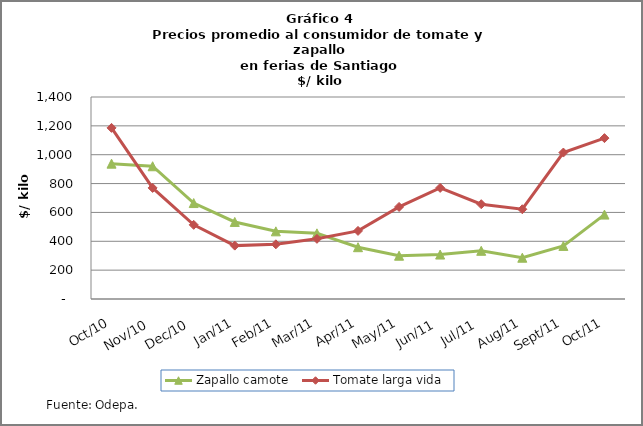
| Category | Zapallo camote | Tomate larga vida |
|---|---|---|
| 2010-10-01 | 938 | 1186 |
| 2010-11-01 | 920 | 770 |
| 2010-12-01 | 665 | 514 |
| 2011-01-01 | 534 | 370 |
| 2011-02-01 | 469 | 379 |
| 2011-03-01 | 455 | 417 |
| 2011-04-01 | 359 | 472 |
| 2011-05-01 | 300 | 638 |
| 2011-06-01 | 308 | 770 |
| 2011-07-01 | 334 | 657 |
| 2011-08-01 | 286 | 622 |
| 2011-09-01 | 368 | 1015 |
| 2011-10-01 | 585 | 1115 |